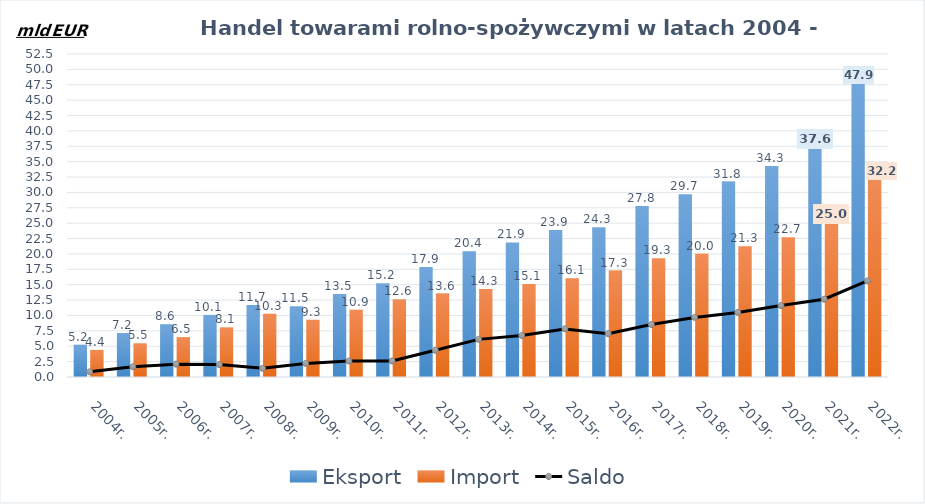
| Category | Eksport | Import |
|---|---|---|
| 2004r. | 5.242 | 4.406 |
| 2005r. | 7.152 | 5.485 |
| 2006r. | 8.577 | 6.486 |
| 2007r. | 10.089 | 8.07 |
| 2008r. | 11.692 | 10.277 |
| 2009r. | 11.499 | 9.299 |
| 2010r. | 13.507 | 10.921 |
| 2011r. | 15.228 | 12.628 |
| 2012r. | 17.893 | 13.557 |
| 2013r. | 20.427 | 14.313 |
| 2014r. | 21.876 | 15.134 |
| 2015r. | 23.887 | 16.068 |
| 2016r. | 24.332 | 17.292 |
| 2017r. | 27.813 | 19.285 |
| 2018r. | 29.717 | 20.033 |
| 2019r. | 31.766 | 21.27 |
| 2020r. | 34.31 | 22.703 |
| 2021r. | 37.611 | 24.967 |
| 2022r. | 47.867 | 32.247 |